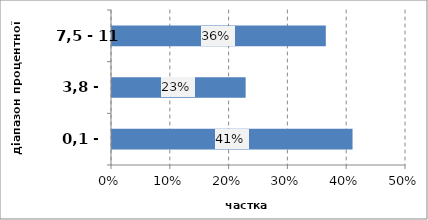
| Category | Series 0 |
|---|---|
| 0,1 - 3,7 | 0.409 |
| 3,8 - 7,4 | 0.227 |
| 7,5 - 11 | 0.364 |